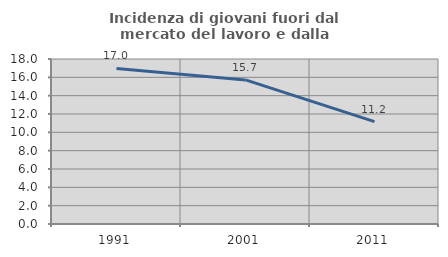
| Category | Incidenza di giovani fuori dal mercato del lavoro e dalla formazione  |
|---|---|
| 1991.0 | 16.974 |
| 2001.0 | 15.721 |
| 2011.0 | 11.168 |